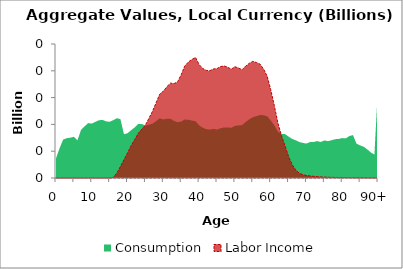
| Category | Consumption | Labor Income |
|---|---|---|
| 0 | 7.359 | 0 |
|  | 11.108 | 0 |
| 2 | 14.343 | 0 |
| 3 | 14.845 | 0 |
| 4 | 15.036 | 0 |
| 5 | 15.387 | 0 |
| 6 | 14.08 | 0 |
| 7 | 17.971 | 0 |
| 8 | 19.286 | 0 |
| 9 | 20.499 | 0 |
| 10 | 20.292 | 0 |
| 11 | 20.943 | 0 |
| 12 | 21.55 | 0 |
| 13 | 21.684 | 0 |
| 14 | 21.131 | 0 |
| 15 | 20.985 | 0 |
| 16 | 21.573 | 0.237 |
| 17 | 22.303 | 1.78 |
| 18 | 21.986 | 4.267 |
| 19 | 16.333 | 6.816 |
| 20 | 16.696 | 9.369 |
| 21 | 17.853 | 12.055 |
| 22 | 18.889 | 14.337 |
| 23 | 20.176 | 16.689 |
| 24 | 20.171 | 18.254 |
| 25 | 19.56 | 19.73 |
| 26 | 19.895 | 22.328 |
| 27 | 20.29 | 24.971 |
| 28 | 21.258 | 28.14 |
| 29 | 22.272 | 31.291 |
| 30 | 21.837 | 32.402 |
| 31 | 22.141 | 34.082 |
| 32 | 22.138 | 35.384 |
| 33 | 21.263 | 35.247 |
| 34 | 20.818 | 35.866 |
| 35 | 21.065 | 38.581 |
| 36 | 21.835 | 41.795 |
| 37 | 21.724 | 43.271 |
| 38 | 21.431 | 44.247 |
| 39 | 21.199 | 44.974 |
| 40 | 19.668 | 42.326 |
| 41 | 18.777 | 40.884 |
| 42 | 18.225 | 40.137 |
| 43 | 18.05 | 40.013 |
| 44 | 18.337 | 40.683 |
| 45 | 18.075 | 40.824 |
| 46 | 18.552 | 41.562 |
| 47 | 18.886 | 41.809 |
| 48 | 18.881 | 41.317 |
| 49 | 18.749 | 40.577 |
| 50 | 19.445 | 41.527 |
| 51 | 19.602 | 41.049 |
| 52 | 19.736 | 40.404 |
| 53 | 20.865 | 41.745 |
| 54 | 21.905 | 42.763 |
| 55 | 22.666 | 43.529 |
| 56 | 23.083 | 43.097 |
| 57 | 23.525 | 42.522 |
| 58 | 23.412 | 40.71 |
| 59 | 23.07 | 38.051 |
| 60 | 21.535 | 33.039 |
| 61 | 19.658 | 27.137 |
| 62 | 17.335 | 20.644 |
| 63 | 16.422 | 15.907 |
| 64 | 16.388 | 12.051 |
| 65 | 15.479 | 8.069 |
| 66 | 14.597 | 5.019 |
| 67 | 14.075 | 3.018 |
| 68 | 13.426 | 1.798 |
| 69 | 13.087 | 1.233 |
| 70 | 12.855 | 0.944 |
| 71 | 13.398 | 0.771 |
| 72 | 13.429 | 0.608 |
| 73 | 13.766 | 0.506 |
| 74 | 13.448 | 0.409 |
| 75 | 14.008 | 0.352 |
| 76 | 13.738 | 0.281 |
| 77 | 14.079 | 0.24 |
| 78 | 14.482 | 0.217 |
| 79 | 14.579 | 0.183 |
| 80 | 14.891 | 0.15 |
| 81 | 14.783 | 0.123 |
| 82 | 15.653 | 0.111 |
| 83 | 16.027 | 0.097 |
| 84 | 12.785 | 0.07 |
| 85 | 12.175 | 0.06 |
| 86 | 11.661 | 0.048 |
| 87 | 10.685 | 0.037 |
| 88 | 9.54 | 0.028 |
| 89 | 8.778 | 0.021 |
| 90+ | 33.885 | 0.024 |